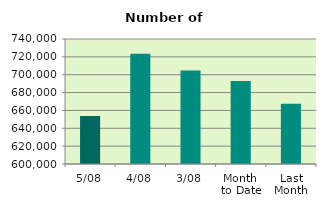
| Category | Series 0 |
|---|---|
| 5/08 | 653794 |
| 4/08 | 723608 |
| 3/08 | 704598 |
| Month 
to Date | 692981 |
| Last
Month | 667427.091 |